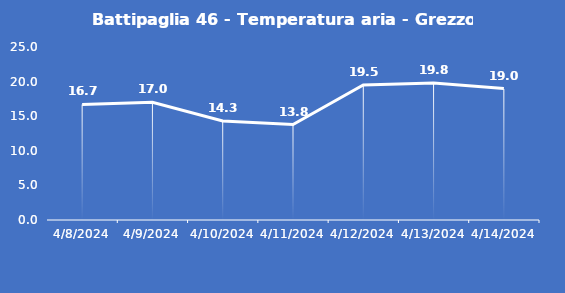
| Category | Battipaglia 46 - Temperatura aria - Grezzo (°C) |
|---|---|
| 4/8/24 | 16.7 |
| 4/9/24 | 17 |
| 4/10/24 | 14.3 |
| 4/11/24 | 13.8 |
| 4/12/24 | 19.5 |
| 4/13/24 | 19.8 |
| 4/14/24 | 19 |